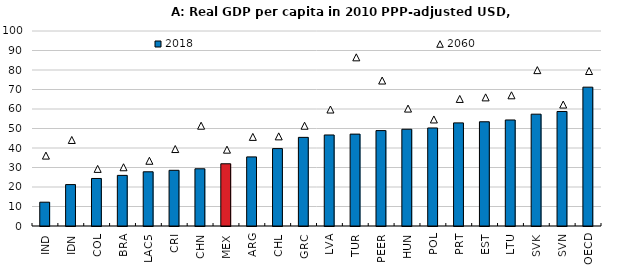
| Category | 2018 |
|---|---|
| IND | 12.21 |
| IDN | 21.237 |
| COL | 24.374 |
| BRA | 25.956 |
| LAC5 | 27.803 |
| CRI | 28.559 |
| CHN | 29.347 |
| MEX | 31.908 |
| ARG | 35.427 |
| CHL | 39.696 |
| GRC | 45.455 |
| LVA | 46.681 |
| TUR | 47.119 |
| PEER | 48.92 |
| HUN | 49.618 |
| POL | 50.269 |
| PRT | 52.881 |
| EST | 53.453 |
| LTU | 54.374 |
| SVK | 57.344 |
| SVN | 58.727 |
| OECD | 71.201 |